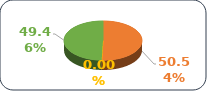
| Category | Series 0 |
|---|---|
| 0 | 0.505 |
| 1 | 0 |
| 2 | 0.495 |